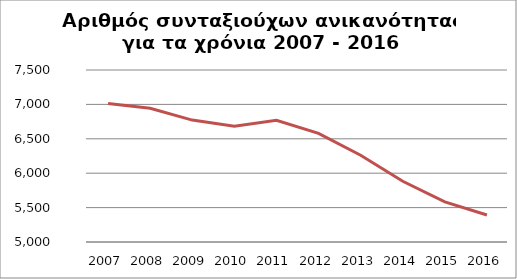
| Category | Series 1 |
|---|---|
| 2007.0 | 7013 |
| 2008.0 | 6944 |
| 2009.0 | 6772 |
| 2010.0 | 6683 |
| 2011.0 | 6768 |
| 2012.0 | 6578 |
| 2013.0 | 6261 |
| 2014.0 | 5883 |
| 2015.0 | 5583 |
| 2016.0 | 5392 |